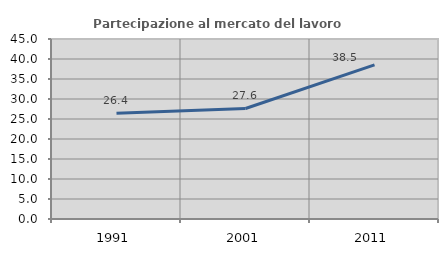
| Category | Partecipazione al mercato del lavoro  femminile |
|---|---|
| 1991.0 | 26.42 |
| 2001.0 | 27.628 |
| 2011.0 | 38.532 |